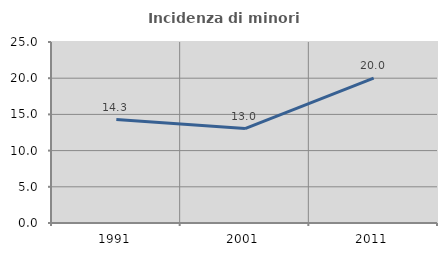
| Category | Incidenza di minori stranieri |
|---|---|
| 1991.0 | 14.286 |
| 2001.0 | 13.043 |
| 2011.0 | 20 |